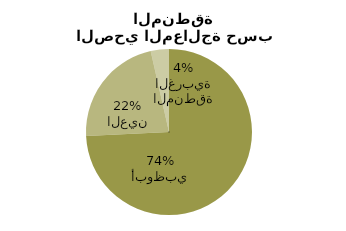
| Category | Series 0 |
|---|---|
| أبوظبي | 183.04 |
| العين | 54.75 |
| المنطقة الغربية | 8.753 |